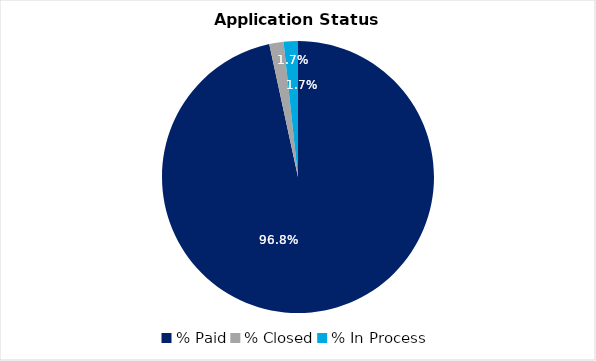
| Category | Series 0 |
|---|---|
| % Paid | 0.968 |
| % Closed | 0.017 |
| % In Process | 0.017 |